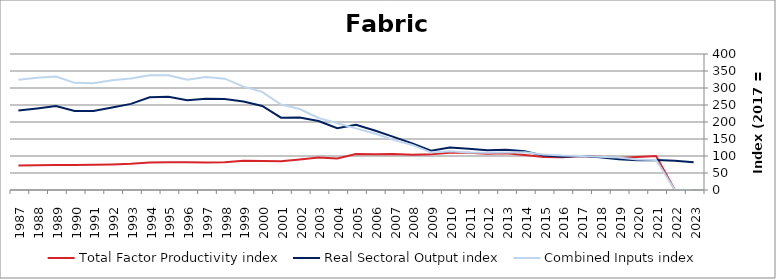
| Category | Total Factor Productivity index | Real Sectoral Output index | Combined Inputs index |
|---|---|---|---|
| 2023.0 | 0 | 81.325 | 0 |
| 2022.0 | 0 | 85.959 | 0 |
| 2021.0 | 100.157 | 88.514 | 88.375 |
| 2020.0 | 96.825 | 87.175 | 90.034 |
| 2019.0 | 94.407 | 90.446 | 95.804 |
| 2018.0 | 98.15 | 96.243 | 98.057 |
| 2017.0 | 100 | 100 | 100 |
| 2016.0 | 96.649 | 98.012 | 101.41 |
| 2015.0 | 96.959 | 101.172 | 104.345 |
| 2014.0 | 102.75 | 113.789 | 110.744 |
| 2013.0 | 107.746 | 118.541 | 110.019 |
| 2012.0 | 106.705 | 117.158 | 109.797 |
| 2011.0 | 109.822 | 121.118 | 110.285 |
| 2010.0 | 109.569 | 125.016 | 114.097 |
| 2009.0 | 105.097 | 115.789 | 110.173 |
| 2008.0 | 103.376 | 137.088 | 132.61 |
| 2007.0 | 106.07 | 156.288 | 147.344 |
| 2006.0 | 105.333 | 174.904 | 166.048 |
| 2005.0 | 105.796 | 191.777 | 181.27 |
| 2004.0 | 92.617 | 181.667 | 196.148 |
| 2003.0 | 95.791 | 202.84 | 211.753 |
| 2002.0 | 89.688 | 213.496 | 238.042 |
| 2001.0 | 84.752 | 212.687 | 250.951 |
| 2000.0 | 85.603 | 247.004 | 288.547 |
| 1999.0 | 85.705 | 260.512 | 303.963 |
| 1998.0 | 81.67 | 267.453 | 327.479 |
| 1997.0 | 80.717 | 268.457 | 332.592 |
| 1996.0 | 81.357 | 263.763 | 324.204 |
| 1995.0 | 81.309 | 274.274 | 337.323 |
| 1994.0 | 80.821 | 272.625 | 337.32 |
| 1993.0 | 77.145 | 253.25 | 328.276 |
| 1992.0 | 75.191 | 242.865 | 322.997 |
| 1991.0 | 74.062 | 232.595 | 314.055 |
| 1990.0 | 73.737 | 232.403 | 315.179 |
| 1989.0 | 73.872 | 246.679 | 333.928 |
| 1988.0 | 72.649 | 240.043 | 330.414 |
| 1987.0 | 72.053 | 233.603 | 324.211 |